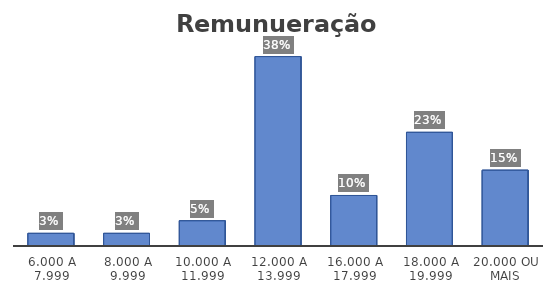
| Category | Series 0 |
|---|---|
| 6.000 a 7.999 | 0.026 |
| 8.000 a 9.999 | 0.026 |
| 10.000 a 11.999 | 0.051 |
| 12.000 a 13.999 | 0.385 |
| 16.000 a 17.999 | 0.103 |
| 18.000 a 19.999 | 0.231 |
| 20.000 ou mais | 0.154 |